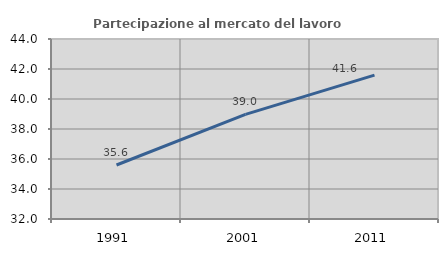
| Category | Partecipazione al mercato del lavoro  femminile |
|---|---|
| 1991.0 | 35.6 |
| 2001.0 | 38.976 |
| 2011.0 | 41.593 |